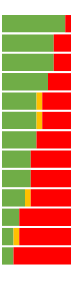
| Category | Series 0 | Series 2 | Series 1 |
|---|---|---|---|
| 0 | 11 | 0 | 1 |
| 1 | 9 | 0 | 3 |
| 2 | 9 | 0 | 3 |
| 3 | 8 | 0 | 4 |
| 4 | 6 | 1 | 5 |
| 5 | 6 | 1 | 5 |
| 6 | 6 | 0 | 6 |
| 7 | 5 | 0 | 7 |
| 8 | 5 | 0 | 7 |
| 9 | 4 | 1 | 7 |
| 10 | 3 | 0 | 9 |
| 11 | 2 | 1 | 9 |
| 12 | 2 | 0 | 10 |
| 13 | 0 | 0 | 0 |